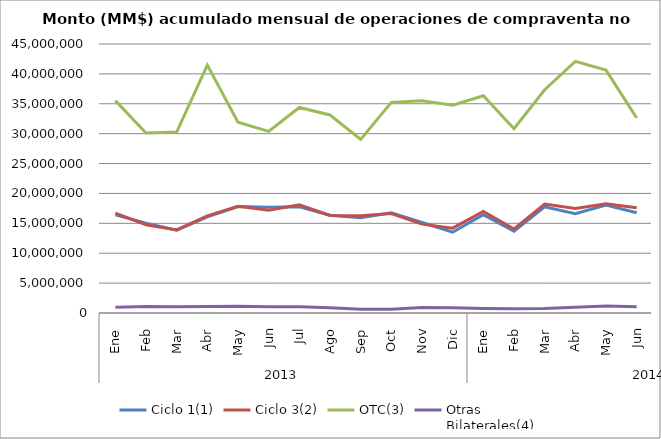
| Category | Ciclo 1(1) | Ciclo 3(2) | OTC(3) | Otras
Bilaterales(4) |
|---|---|---|---|---|
| 0 | 16417241.727 | 16700335.202 | 35523809.408 | 972958.086 |
| 1 | 15037741.172 | 14773657.586 | 30102338.851 | 1073496.596 |
| 2 | 13848943.779 | 13900402.205 | 30273669.122 | 1026617.054 |
| 3 | 16086096.035 | 16245696.168 | 41465554.082 | 1105720.368 |
| 4 | 17801790.619 | 17838763.351 | 31909646.654 | 1133512.85 |
| 5 | 17684542.956 | 17179330.609 | 30372188.279 | 1025162.543 |
| 6 | 17771623.451 | 18089502.524 | 34376831.202 | 1053340.718 |
| 7 | 16359818.954 | 16327115.519 | 33128143.288 | 882723.558 |
| 8 | 15949862.744 | 16281684.387 | 29025705.039 | 624893.462 |
| 9 | 16760948.703 | 16634867.291 | 35234004.542 | 641647.876 |
| 10 | 15133528.556 | 14863555.208 | 35512550.02 | 915020.525 |
| 11 | 13509827.678 | 14192849.668 | 34769513.126 | 877765.247 |
| 12 | 16434121.823 | 16973216.875 | 36341658.718 | 750147.378 |
| 13 | 13675521.943 | 14060199.134 | 30828680.35 | 721919.806 |
| 14 | 17760484.117 | 18231676.991 | 37344676.439 | 768460.999 |
| 15 | 16615436.994 | 17468955.339 | 42094978.158 | 945494.284 |
| 16 | 18046213.572 | 18258193.447 | 40638812.154 | 1185202.419 |
| 17 | 16777760.924 | 17604169.829 | 32614242.011 | 1051618.708 |